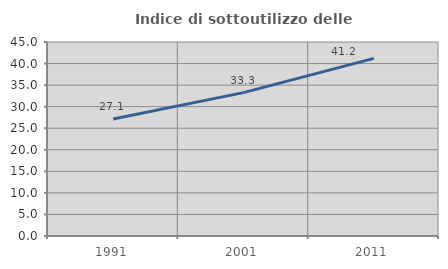
| Category | Indice di sottoutilizzo delle abitazioni  |
|---|---|
| 1991.0 | 27.137 |
| 2001.0 | 33.253 |
| 2011.0 | 41.209 |